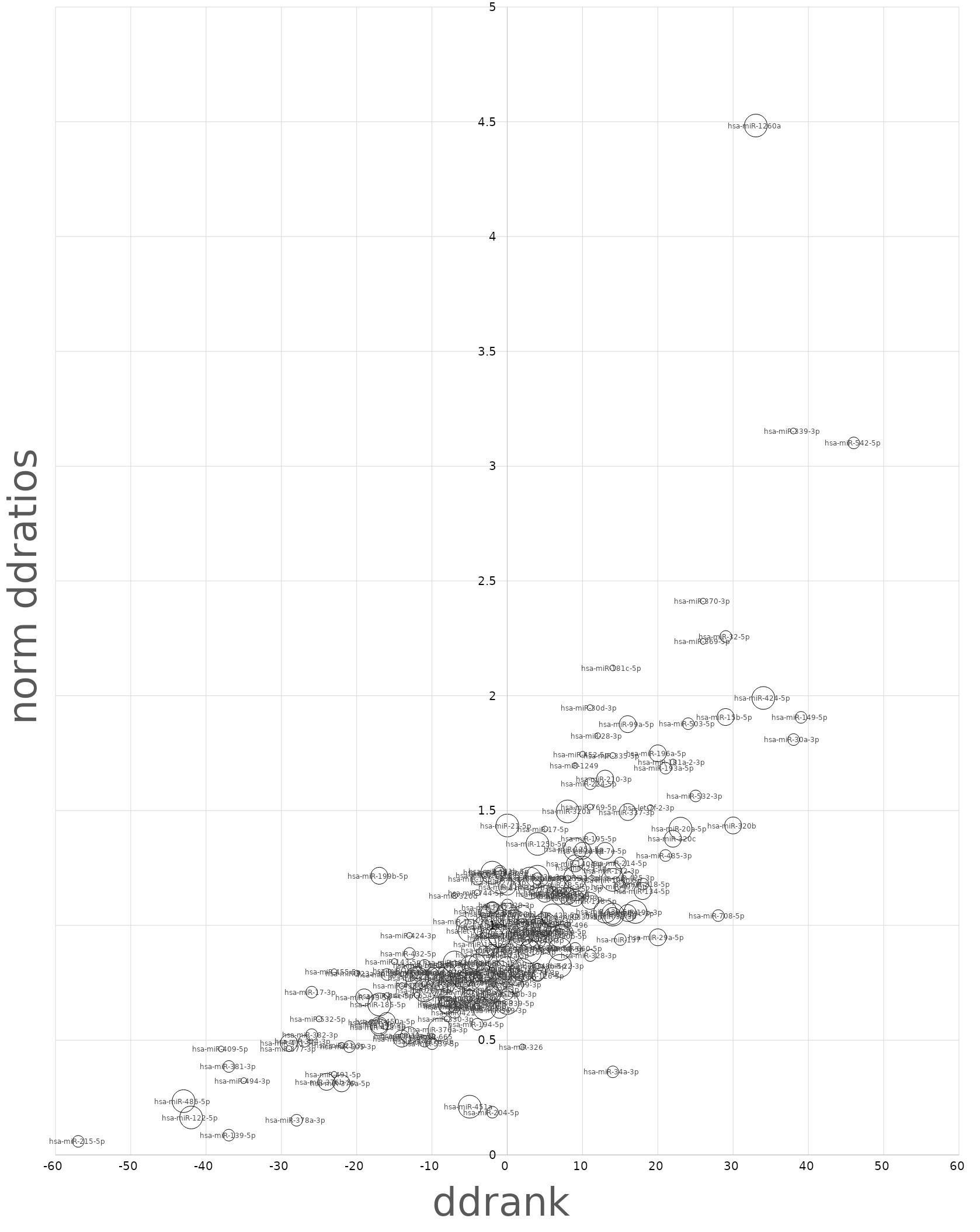
| Category | Series 0 |
|---|---|
| -1.0 | 0.789 |
| -2.0 | 0.806 |
| -6.0 | 0.784 |
| -4.0 | 0.648 |
| -35.0 | 0.324 |
| 8.0 | 1.206 |
| -37.0 | 0.386 |
| -22.0 | 0.478 |
| -1.0 | 1.228 |
| 26.0 | 2.413 |
| -4.0 | 1.143 |
| -16.0 | 0.694 |
| 7.0 | 0.974 |
| -38.0 | 0.462 |
| -3.0 | 1.219 |
| 12.0 | 1.826 |
| 22.0 | 1.712 |
| -20.0 | 0.792 |
| -12.0 | 0.697 |
| -15.0 | 0.843 |
| -9.0 | 0.826 |
| -1.0 | 1.236 |
| 10.0 | 1.746 |
| 11.0 | 1.618 |
| -23.0 | 0.798 |
| -25.0 | 0.593 |
| 2.0 | 0.969 |
| -2.0 | 0.699 |
| -14.0 | 0.804 |
| -13.0 | 0.878 |
| -19.0 | 0.686 |
| -16.0 | 0.787 |
| 11.0 | 1.516 |
| -3.0 | 0.873 |
| -26.0 | 0.525 |
| -12.0 | 0.795 |
| -13.0 | 0.956 |
| -8.0 | 0.594 |
| 38.0 | 1.81 |
| -5.0 | 0.71 |
| 4.0 | 1.204 |
| -17.0 | 1.216 |
| -14.0 | 0.738 |
| 5.0 | 1.023 |
| -4.0 | 1.202 |
| 18.0 | 1.149 |
| 14.0 | 2.122 |
| -8.0 | 0.797 |
| 7.0 | 1.128 |
| -2.0 | 1.079 |
| -10.0 | 0.792 |
| 21.0 | 1.686 |
| -8.0 | 0.744 |
| 1.0 | 0.741 |
| -6.0 | 0.781 |
| -4.0 | 0.67 |
| -5.0 | 0.678 |
| -5.0 | 0.977 |
| 20.0 | 1.749 |
| -11.0 | 0.717 |
| -5.0 | 0.831 |
| -6.0 | 0.759 |
| -3.0 | 0.669 |
| 4.0 | 0.823 |
| -11.0 | 0.826 |
| 5.0 | 1.42 |
| -2.0 | 0.992 |
| 13.0 | 1.324 |
| -18.0 | 0.577 |
| 18.0 | 1.181 |
| -29.0 | 0.464 |
| 9.0 | 1.159 |
| 24.0 | 1.879 |
| -3.0 | 0.637 |
| 2.0 | 1.005 |
| -7.0 | 0.839 |
| 5.0 | 0.983 |
| 4.0 | 0.964 |
| -2.0 | 0.722 |
| 7.0 | 0.824 |
| 0.0 | 1.089 |
| -4.0 | 0.64 |
| 16.0 | 1.876 |
| 5.0 | 0.904 |
| -2.0 | 0.946 |
| -2.0 | 1.23 |
| -29.0 | 0.488 |
| 11.0 | 1.949 |
| 1.0 | 0.776 |
| -23.0 | 0.351 |
| -13.0 | 0.521 |
| 26.0 | 2.237 |
| -5.0 | 0.749 |
| -7.0 | 0.795 |
| 0.0 | 1.169 |
| 38.0 | 3.154 |
| 2.0 | 0.962 |
| -2.0 | 0.893 |
| 0.0 | 0.896 |
| -1.0 | 0.953 |
| -1.0 | 0.955 |
| 13.0 | 1.639 |
| 9.0 | 0.9 |
| 10.0 | 1.325 |
| 8.0 | 1.002 |
| 0.0 | 0.87 |
| 1.0 | 1.017 |
| -8.0 | 0.658 |
| -13.0 | 0.792 |
| 4.0 | 0.936 |
| 15.0 | 0.939 |
| 5.0 | 1.007 |
| 3.0 | 1.164 |
| 9.0 | 1.331 |
| 0.0 | 1.435 |
| -5.0 | 0.766 |
| 9.0 | 1.038 |
| 21.0 | 1.305 |
| 5.0 | 0.966 |
| 28.0 | 1.043 |
| -16.0 | 0.583 |
| 6.0 | 1.144 |
| 14.0 | 1.74 |
| -1.0 | 0.796 |
| 7.0 | 1.14 |
| -1.0 | 1.188 |
| 4.0 | 1.355 |
| -10.0 | 0.517 |
| 7.0 | 1.177 |
| -11.0 | 0.497 |
| -21.0 | 0.473 |
| -14.0 | 0.516 |
| 11.0 | 0.869 |
| 9.0 | 1.209 |
| -9.0 | 0.769 |
| 8.0 | 1.497 |
| -3.0 | 0.762 |
| -3.0 | 0.994 |
| 6.0 | 1.044 |
| -2.0 | 1.051 |
| -12.0 | 0.771 |
| -1.0 | 0.835 |
| 16.0 | 1.208 |
| 0.0 | 0.769 |
| -1.0 | 1.029 |
| 19.0 | 1.513 |
| -17.0 | 0.656 |
| -5.0 | 0.684 |
| 39.0 | 1.907 |
| -7.0 | 0.622 |
| 3.0 | 1.204 |
| -9.0 | 0.724 |
| -4.0 | 0.837 |
| 25.0 | 1.565 |
| -17.0 | 0.556 |
| 0.0 | 1.047 |
| -7.0 | 1.13 |
| 10.0 | 1.252 |
| -17.0 | 0.564 |
| -11.0 | 0.745 |
| -10.0 | 0.486 |
| 9.0 | 1.119 |
| -7.0 | 0.645 |
| -27.0 | 0.496 |
| -57.0 | 0.06 |
| -3.0 | 0.791 |
| 9.0 | 1.27 |
| 11.0 | 1.379 |
| 4.0 | 1.212 |
| 29.0 | 2.259 |
| -28.0 | 0.152 |
| 14.0 | 1.239 |
| 9.0 | 1.697 |
| -3.0 | 0.918 |
| 8.0 | 1.127 |
| -37.0 | 0.087 |
| 2.0 | 0.471 |
| -8.0 | 0.655 |
| 15.0 | 1.171 |
| 3.0 | 0.941 |
| -6.0 | 1.017 |
| 15.0 | 1.273 |
| -4.0 | 0.57 |
| -8.0 | 0.65 |
| 11.0 | 1.107 |
| -2.0 | 0.187 |
| -8.0 | 0.682 |
| 2.0 | 1.052 |
| -26.0 | 0.71 |
| 0.0 | 0.703 |
| 16.0 | 1.494 |
| 14.0 | 0.363 |
| -1.0 | 0.632 |
| 4.0 | 0.797 |
| -3.0 | 1.059 |
| 3.0 | 0.903 |
| 4.0 | 1.015 |
| 34.0 | 1.991 |
| 14.0 | 1.041 |
| 5.0 | 1.138 |
| 7.0 | 0.955 |
| -14.0 | 0.507 |
| 7.0 | 0.898 |
| 0.0 | 0.814 |
| 46.0 | 3.102 |
| 4.0 | 0.781 |
| 30.0 | 1.435 |
| -43.0 | 0.235 |
| 14.0 | 1.047 |
| 0.0 | 0.662 |
| -1.0 | 0.754 |
| 16.0 | 1.054 |
| 14.0 | 1.198 |
| -9.0 | 0.546 |
| -22.0 | 0.312 |
| -42.0 | 0.164 |
| -24.0 | 0.318 |
| 23.0 | 1.422 |
| 29.0 | 1.907 |
| 13.0 | 1.06 |
| 20.0 | 0.948 |
| 22.0 | 1.377 |
| 2.0 | 0.806 |
| 17.0 | 1.059 |
| 3.0 | 0.885 |
| 4.0 | 0.981 |
| 33.0 | 4.484 |
| -5.0 | 0.211 |